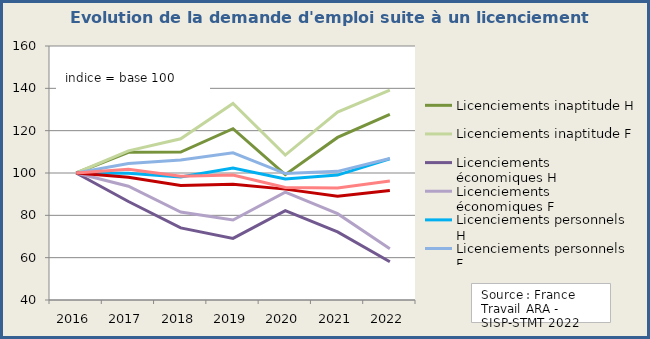
| Category | Licenciements inaptitude H | Licenciements inaptitude F | Licenciements économiques H | Licenciements économiques F | Licenciements personnels H | Licenciements personnels F | Tous motifs d'incriptions H | Tous motifs d'incriptions F |
|---|---|---|---|---|---|---|---|---|
| 2016.0 | 100 | 100 | 100 | 100 | 100 | 100 | 100 | 100 |
| 2017.0 | 109.769 | 110.482 | 86.531 | 93.766 | 99.912 | 104.497 | 98.01 | 101.713 |
| 2018.0 | 109.877 | 116.178 | 74.051 | 81.53 | 98.148 | 106.162 | 94.088 | 98.514 |
| 2019.0 | 120.921 | 132.82 | 69.124 | 77.777 | 102.377 | 109.573 | 94.691 | 99.059 |
| 2020.0 | 99.2 | 108.46 | 82.229 | 90.99 | 97.123 | 99.746 | 92.38 | 93.139 |
| 2021.0 | 116.814 | 128.757 | 72.2 | 80.795 | 99.017 | 100.777 | 89.033 | 92.892 |
| 2022.0 | 127.729 | 139.109 | 58.051 | 64.223 | 106.747 | 106.836 | 91.72 | 96.198 |